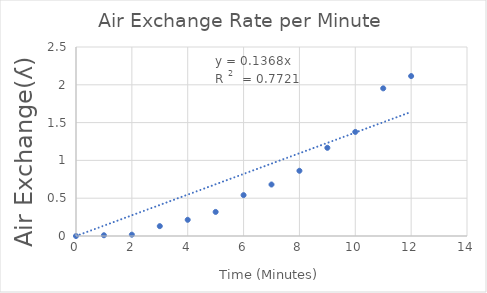
| Category | Series 0 |
|---|---|
| 0.0 | 0 |
| 1.0 | 0.01 |
| 2.0 | 0.017 |
| 3.0 | 0.13 |
| 4.0 | 0.214 |
| 5.0 | 0.318 |
| 6.0 | 0.541 |
| 7.0 | 0.681 |
| 8.0 | 0.863 |
| 9.0 | 1.166 |
| 10.0 | 1.377 |
| 11.0 | 1.953 |
| 12.0 | 2.115 |